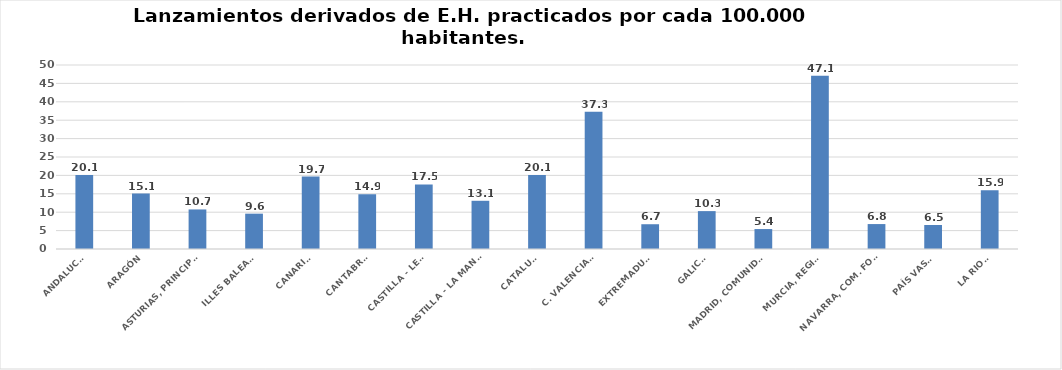
| Category | Series 0 |
|---|---|
| ANDALUCÍA | 20.13 |
| ARAGÓN | 15.079 |
| ASTURIAS, PRINCIPADO | 10.75 |
| ILLES BALEARS | 9.603 |
| CANARIAS | 19.7 |
| CANTABRIA | 14.862 |
| CASTILLA - LEÓN | 17.533 |
| CASTILLA - LA MANCHA | 13.101 |
| CATALUÑA | 20.109 |
| C. VALENCIANA | 37.309 |
| EXTREMADURA | 6.731 |
| GALICIA | 10.296 |
| MADRID, COMUNIDAD | 5.422 |
| MURCIA, REGIÓN | 47.066 |
| NAVARRA, COM. FORAL | 6.776 |
| PAÍS VASCO | 6.521 |
| LA RIOJA | 15.943 |